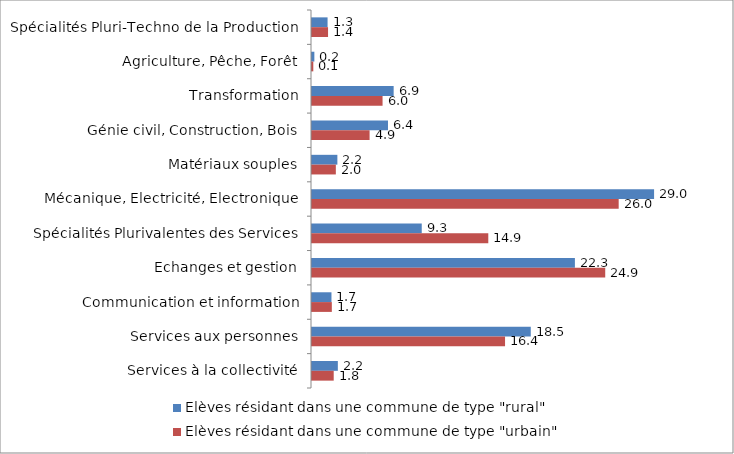
| Category | Elèves résidant dans une commune de type "rural" | Elèves résidant dans une commune de type "urbain" |
|---|---|---|
| Spécialités Pluri-Techno de la Production | 1.32 | 1.36 |
| Agriculture, Pêche, Forêt | 0.2 | 0.11 |
| Transformation | 6.92 | 5.98 |
| Génie civil, Construction, Bois | 6.44 | 4.88 |
| Matériaux souples | 2.15 | 2.02 |
| Mécanique, Electricité, Electronique | 28.99 | 25.99 |
| Spécialités Plurivalentes des Services | 9.3 | 14.94 |
| Echanges et gestion | 22.28 | 24.85 |
| Communication et information | 1.65 | 1.68 |
| Services aux personnes | 18.54 | 16.36 |
| Services à la collectivité | 2.19 | 1.84 |